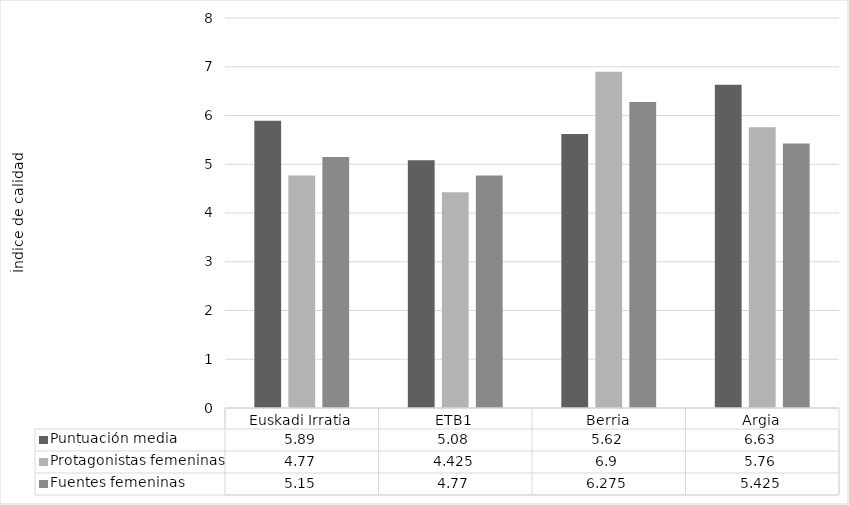
| Category | Puntuación media | Protagonistas femeninas | Fuentes femeninas |
|---|---|---|---|
| Euskadi Irratia | 5.89 | 4.77 | 5.15 |
| ETB1 | 5.08 | 4.425 | 4.77 |
| Berria | 5.62 | 6.9 | 6.275 |
| Argia | 6.63 | 5.76 | 5.425 |